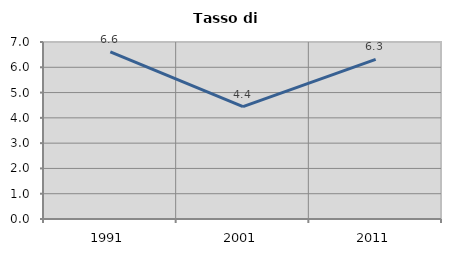
| Category | Tasso di disoccupazione   |
|---|---|
| 1991.0 | 6.614 |
| 2001.0 | 4.443 |
| 2011.0 | 6.315 |